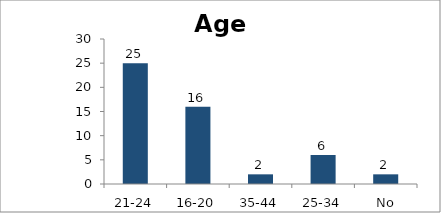
| Category | Age |
|---|---|
| 21-24 | 25 |
| 16-20 | 16 |
| 35-44 | 2 |
| 25-34 | 6 |
| No answer | 2 |